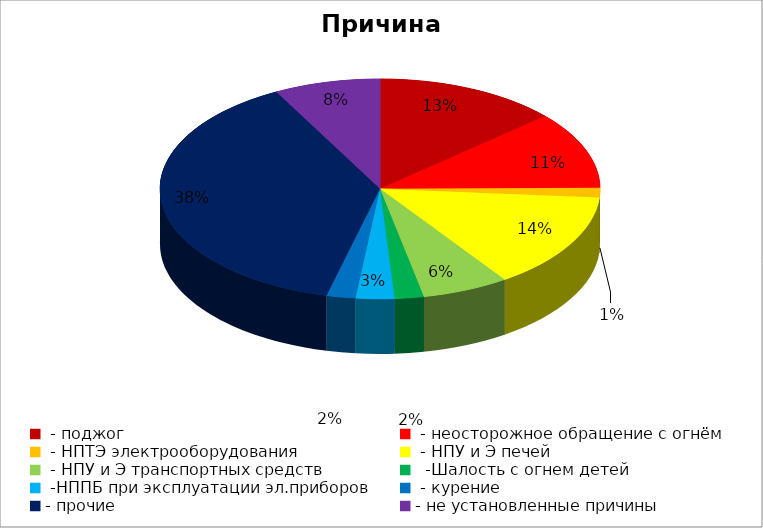
| Category | Причина пожара |
|---|---|
|  - поджог | 19 |
|  - неосторожное обращение с огнём | 16 |
|  - НПТЭ электрооборудования | 2 |
|  - НПУ и Э печей | 20 |
|  - НПУ и Э транспортных средств | 9 |
|   -Шалость с огнем детей | 3 |
|  -НППБ при эксплуатации эл.приборов | 4 |
|  - курение | 3 |
| - прочие | 54 |
| - не установленные причины | 11 |